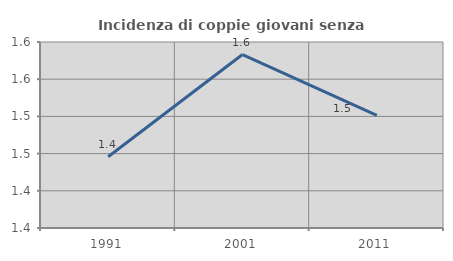
| Category | Incidenza di coppie giovani senza figli |
|---|---|
| 1991.0 | 1.446 |
| 2001.0 | 1.583 |
| 2011.0 | 1.502 |